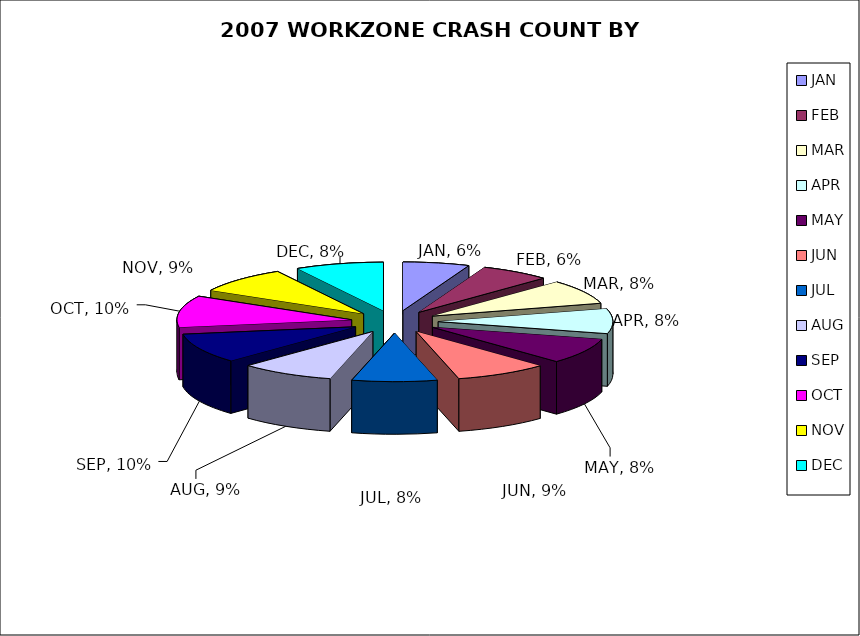
| Category | Month |
|---|---|
| JAN | 0.062 |
| FEB | 0.065 |
| MAR | 0.081 |
| APR | 0.082 |
| MAY | 0.085 |
| JUN | 0.086 |
| JUL | 0.079 |
| AUG | 0.087 |
| SEP | 0.099 |
| OCT | 0.105 |
| NOV | 0.088 |
| DEC | 0.082 |